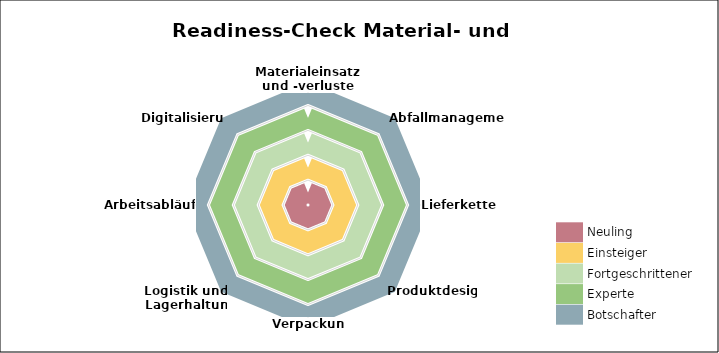
| Category | Neuling | Einsteiger | Fortgeschrittener | Experte | Botschafter | Bewertung |
|---|---|---|---|---|---|---|
| Materialeinsatz und -verluste | 0.5 | 1.5 | 2.5 | 3.5 | 4.5 |  |
| Abfallmanagement | 0.5 | 1.5 | 2.5 | 3.5 | 4.5 |  |
| Lieferketten | 0.5 | 1.5 | 2.5 | 3.5 | 4.5 |  |
| Produktdesign | 0.5 | 1.5 | 2.5 | 3.5 | 4.5 |  |
| Verpackung | 0.5 | 1.5 | 2.5 | 3.5 | 4.5 |  |
| Logistik und Lagerhaltung | 0.5 | 1.5 | 2.5 | 3.5 | 4.5 |  |
| Arbeitsabläufe | 0.5 | 1.5 | 2.5 | 3.5 | 4.5 |  |
| Digitalisierung | 0.5 | 1.5 | 2.5 | 3.5 | 4.5 |  |